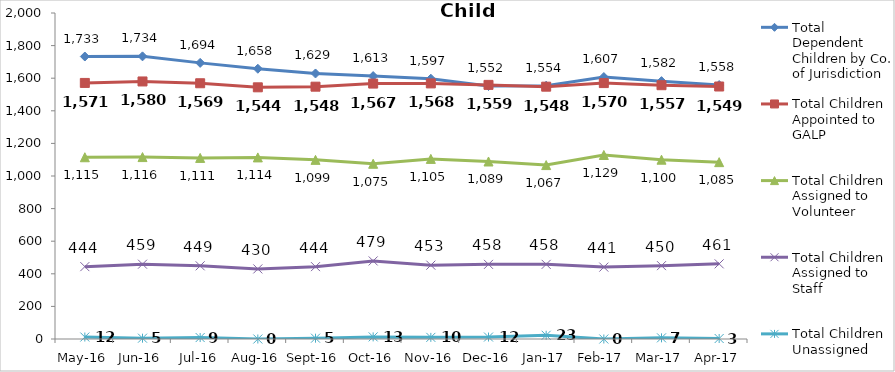
| Category | Total Dependent Children by Co. of Jurisdiction | Total Children Appointed to GALP | Total Children Assigned to Volunteer | Total Children Assigned to Staff | Total Children Unassigned |
|---|---|---|---|---|---|
| May-16 | 1733 | 1571 | 1115 | 444 | 12 |
| Jun-16 | 1734 | 1580 | 1116 | 459 | 5 |
| Jul-16 | 1694 | 1569 | 1111 | 449 | 9 |
| Aug-16 | 1658 | 1544 | 1114 | 430 | 0 |
| Sep-16 | 1629 | 1548 | 1099 | 444 | 5 |
| Oct-16 | 1613 | 1567 | 1075 | 479 | 13 |
| Nov-16 | 1597 | 1568 | 1105 | 453 | 10 |
| Dec-16 | 1552 | 1559 | 1089 | 458 | 12 |
| Jan-17 | 1554 | 1548 | 1067 | 458 | 23 |
| Feb-17 | 1607 | 1570 | 1129 | 441 | 0 |
| Mar-17 | 1582 | 1557 | 1100 | 450 | 7 |
| Apr-17 | 1558 | 1549 | 1085 | 461 | 3 |